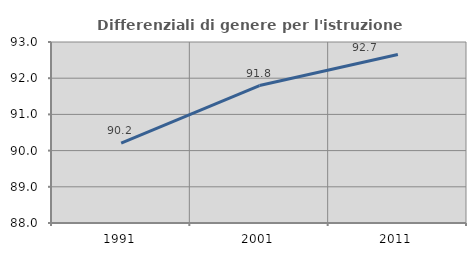
| Category | Differenziali di genere per l'istruzione superiore |
|---|---|
| 1991.0 | 90.208 |
| 2001.0 | 91.797 |
| 2011.0 | 92.655 |